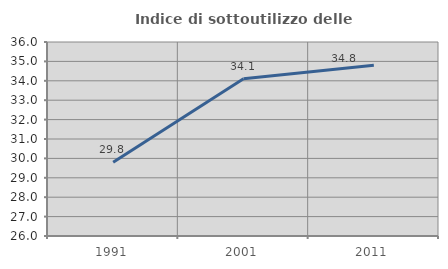
| Category | Indice di sottoutilizzo delle abitazioni  |
|---|---|
| 1991.0 | 29.796 |
| 2001.0 | 34.103 |
| 2011.0 | 34.797 |